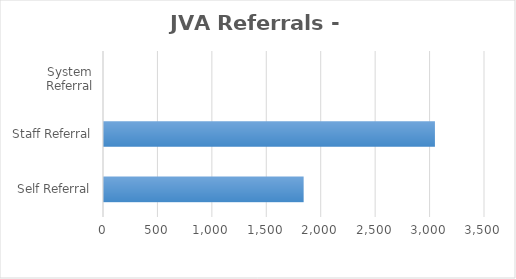
| Category | Series 0 |
|---|---|
| Self Referral | 1834 |
| Staff Referral | 3040 |
| System Referral | 0 |